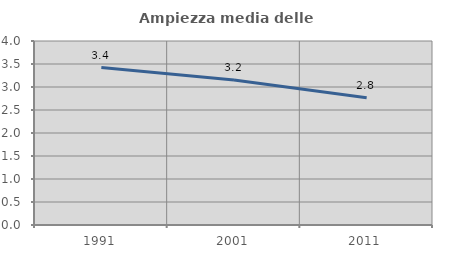
| Category | Ampiezza media delle famiglie |
|---|---|
| 1991.0 | 3.422 |
| 2001.0 | 3.15 |
| 2011.0 | 2.767 |